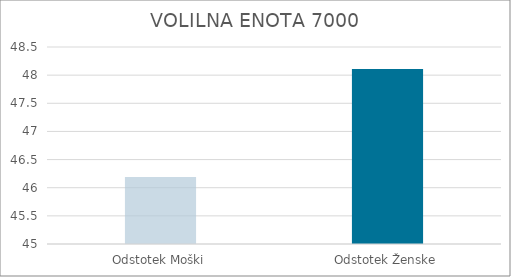
| Category | Series 0 |
|---|---|
| Odstotek Moški | 46.19 |
| Odstotek Ženske | 48.11 |